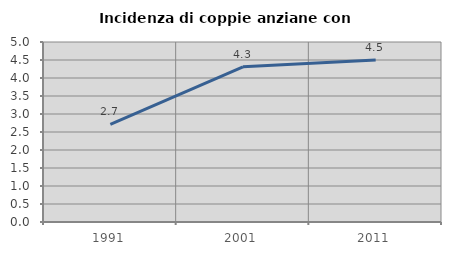
| Category | Incidenza di coppie anziane con figli |
|---|---|
| 1991.0 | 2.712 |
| 2001.0 | 4.312 |
| 2011.0 | 4.498 |